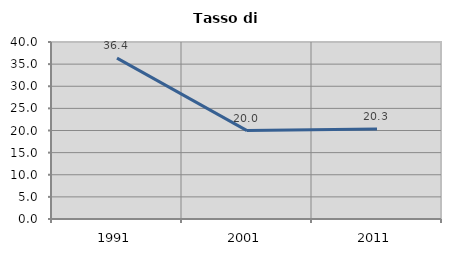
| Category | Tasso di disoccupazione   |
|---|---|
| 1991.0 | 36.364 |
| 2001.0 | 19.981 |
| 2011.0 | 20.328 |